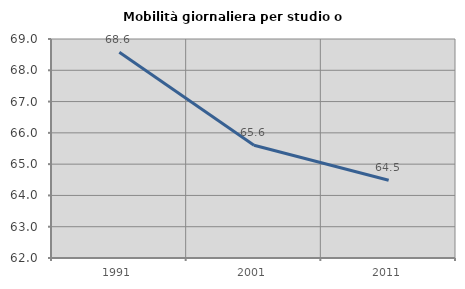
| Category | Mobilità giornaliera per studio o lavoro |
|---|---|
| 1991.0 | 68.574 |
| 2001.0 | 65.603 |
| 2011.0 | 64.486 |